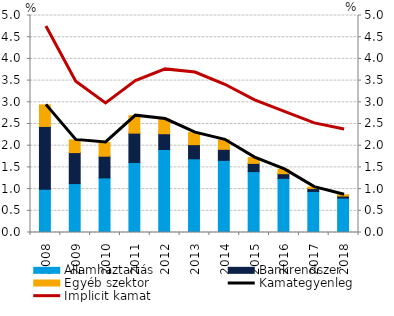
| Category | Államháztartás | Bankrendszer | Egyéb szektor |
|---|---|---|---|
| 0 | 0.998 | 1.445 | 0.497 |
| 1 | 1.127 | 0.714 | 0.292 |
| 2 | 1.258 | 0.5 | 0.319 |
| 3 | 1.614 | 0.676 | 0.402 |
| 4 | 1.912 | 0.364 | 0.338 |
| 5 | 1.698 | 0.326 | 0.277 |
| 6 | 1.663 | 0.253 | 0.22 |
| 7 | 1.404 | 0.188 | 0.134 |
| 8 | 1.247 | 0.108 | 0.1 |
| 9 | 0.946 | 0.065 | 0.034 |
| 10 | 0.792 | 0.048 | 0.029 |